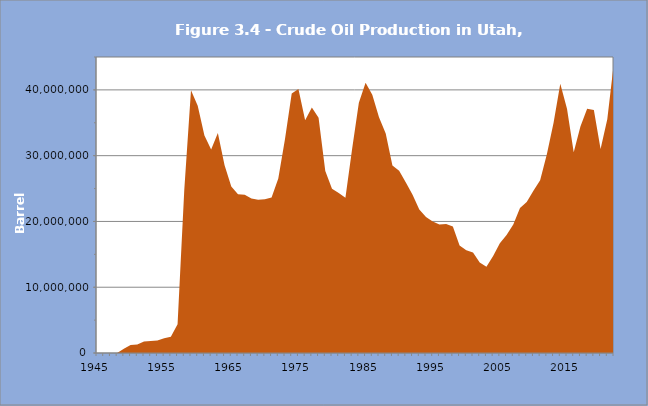
| Category | Series 0 |
|---|---|
| 1945 | 0 |
| 1946 | 0 |
| 1947 | 0 |
| 1948 | 16000 |
| 1949 | 637000 |
| 1950 | 1228000 |
| 1951 | 1305000 |
| 1952 | 1737000 |
| 1953 | 1807000 |
| 1954 | 1905000 |
| 1955 | 2227000 |
| 1956 | 2466000 |
| 1957 | 4367000 |
| 1958 | 24811000 |
| 1959 | 39959000 |
| 1960 | 37595624 |
| 1961 | 33083532 |
| 1962 | 30953140 |
| 1963 | 33448539 |
| 1964 | 28554988 |
| 1965 | 25319032 |
| 1966 | 24150392 |
| 1967 | 24044187 |
| 1968 | 23504076 |
| 1969 | 23305504 |
| 1970 | 23365737 |
| 1971 | 23629644 |
| 1972 | 26510196 |
| 1973 | 32543791 |
| 1974 | 39442793 |
| 1975 | 40144239 |
| 1976 | 35384000 |
| 1977 | 37316000 |
| 1978 | 35765000 |
| 1979 | 27652396 |
| 1980 | 24978654 |
| 1981 | 24309495 |
| 1982 | 23595261 |
| 1983 | 31045199 |
| 1984 | 38053871 |
| 1985 | 41079871 |
| 1986 | 39243487 |
| 1987 | 35828536 |
| 1988 | 33364938 |
| 1989 | 28504075 |
| 1990 | 27705048 |
| 1991 | 25927639 |
| 1992 | 24073573 |
| 1993 | 21825986 |
| 1994 | 20667621 |
| 1995 | 19975648 |
| 1996 | 19528780 |
| 1997 | 19592548 |
| 1998 | 19218109 |
| 1999 | 16361852 |
| 2000 | 15608200 |
| 2001 | 15270624 |
| 2002 | 13769614 |
| 2003 | 13096043 |
| 2004 | 14741847 |
| 2005 | 16675452 |
| 2006 | 17925870 |
| 2007 | 19534129 |
| 2008 | 22039548 |
| 2009 | 22940830 |
| 2010 | 24665621 |
| 2011 | 26276322 |
| 2012 | 30203782 |
| 2013 | 35001772 |
| 2014 | 40914423 |
| 2015 | 37136358 |
| 2016 | 30528349 |
| 2017 | 34437937 |
| 2018 | 37116941 |
| 2019 | 36933430 |
| 2020 | 31000987 |
| 2021 | 35517807 |
| 2022 | 44262756 |